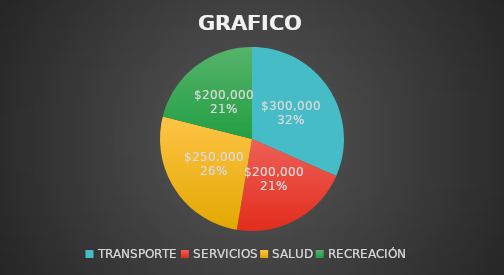
| Category | Series 0 |
|---|---|
| TRANSPORTE | 300000 |
| SERVICIOS | 200000 |
| SALUD | 250000 |
| RECREACIÓN | 200000 |